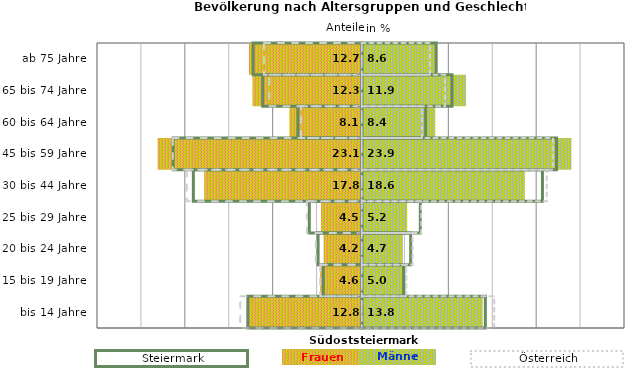
| Category | Frauen | Männer | Frauen Spalte2 | Männer Spalte2 | Frauen Spalte3 | Männer Spalte3 |
|---|---|---|---|---|---|---|
| bis 14 Jahre | -12.8 | 13.8 | 14.1 | -13 | -13.8 | 15.1 |
| 15 bis 19 Jahre | -4.6 | 5 | 4.8 | -4.4 | -4.7 | 5.1 |
| 20 bis 24 Jahre | -4.2 | 4.7 | 5.6 | -5 | -5.2 | 5.8 |
| 25 bis 29 Jahre | -4.5 | 5.2 | 6.7 | -6 | -6.2 | 6.8 |
| 30 bis 44 Jahre | -17.8 | 18.6 | 20.6 | -19.2 | -19.9 | 21.1 |
| 45 bis 59 Jahre | -23.1 | 23.9 | 22.2 | -21.5 | -21.5 | 21.8 |
| 60 bis 64 Jahre | -8.1 | 8.4 | 7.3 | -7.3 | -6.9 | 6.9 |
| 65 bis 74 Jahre | -12.3 | 11.9 | 10.3 | -11.3 | -10.5 | 9.5 |
| ab 75 Jahre | -12.7 | 8.6 | 8.5 | -12.4 | -11.1 | 7.8 |